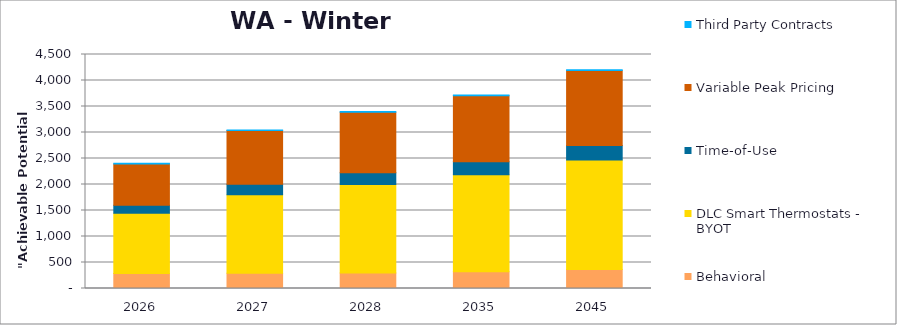
| Category | Behavioral | DLC Smart Thermostats - BYOT | Time-of-Use | Variable Peak Pricing | Third Party Contracts |
|---|---|---|---|---|---|
| 2026.0 | 290.479 | 1155.9 | 154.55 | 794.025 | 11.635 |
| 2027.0 | 293.96 | 1509.114 | 201.229 | 1033.771 | 11.85 |
| 2028.0 | 297.485 | 1702.753 | 226.425 | 1163.132 | 12.07 |
| 2035.0 | 323.405 | 1865.403 | 247.341 | 1269.984 | 13.724 |
| 2045.0 | 364.525 | 2105.537 | 280.689 | 1440.258 | 16.488 |